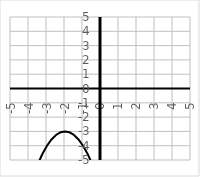
| Category | y |
|---|---|
| -5.0 | -12 |
| -4.75 | -10.562 |
| -4.5 | -9.25 |
| -4.25 | -8.062 |
| -4.0 | -7 |
| -3.75 | -6.062 |
| -3.5 | -5.25 |
| -3.25 | -4.562 |
| -3.0 | -4 |
| -2.75 | -3.562 |
| -2.5 | -3.25 |
| -2.25 | -3.062 |
| -2.0 | -3 |
| -1.75 | -3.062 |
| -1.5 | -3.25 |
| -1.25 | -3.562 |
| -1.0 | -4 |
| -0.75 | -4.562 |
| -0.5 | -5.25 |
| -0.25 | -6.062 |
| 0.0 | -7 |
| 0.25 | -8.062 |
| 0.5 | -9.25 |
| 0.75 | -10.562 |
| 1.0 | -12 |
| 1.25 | -13.562 |
| 1.5 | -15.25 |
| 1.75 | -17.062 |
| 2.0 | -19 |
| 2.25 | -21.062 |
| 2.5 | -23.25 |
| 2.75 | -25.562 |
| 3.0 | -28 |
| 3.25 | -30.562 |
| 3.5 | -33.25 |
| 3.75 | -36.062 |
| 4.0 | -39 |
| 4.25 | -42.062 |
| 4.5 | -45.25 |
| 4.75 | -48.562 |
| 5.0 | -52 |